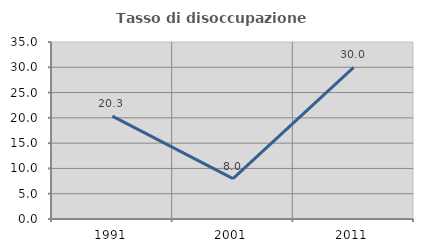
| Category | Tasso di disoccupazione giovanile  |
|---|---|
| 1991.0 | 20.339 |
| 2001.0 | 8 |
| 2011.0 | 30 |